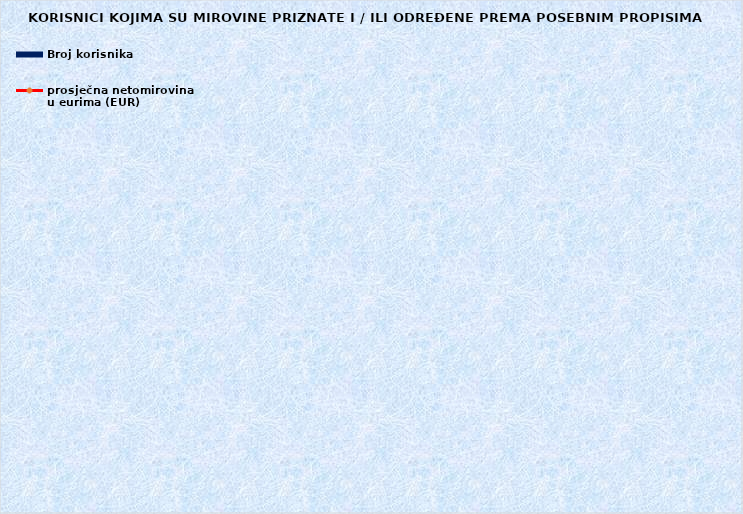
| Category | Broj korisnika |
|---|---|
|      a) radnici na poslovima ovlaštenih službenih osoba u tijelima unutarnjih 
poslova i pravosuđa, kojima je pravo na mirovinu priznato prema propisima
koji su bili na snazi do stupanja na snagu Zakona o pravima iz mirovinskog
osiguranja DVO, PS i OSO | 7064 |
|      b) radnici na  poslovima policijskih službenika, ovlaštenih službenih osoba pravosuđa i službene osobe s posebnim dužnostima i ovlastima u sigurnosno obavještajnom sustavu RH koji su pravo na mirovinu ostvarili prema Zakonu o pravima DVO, PS i OSO | 9452 |
|      c) radnici na poslovima razminiranja | 660 |
| Korisnici koji pravo na mirovinu ostvaruju prema Zakonu o vatrogastvu (NN 125/19)* | 347 |
| Djelatne vojne osobe - DVO  | 16032 |
| Pripadnici Hrvatske domovinske vojske od 1941. do 1945. godine | 1935 |
| Bivši politički zatvorenici | 2084 |
| Hrvatski branitelji iz Domovinskog rata - ZOHBDR | 71255 |
| Mirovine priznate prema općim propisima, a određene prema
ZOHBDR - u iz 2017. (čl. 27., 35., 48. i 49. stavak 2.)  | 57124 |
| Pripadnici bivše Jugoslavenske narodne armije - JNA | 3691 |
| Pripadnici bivše Jugoslavenske narodne armije - JNA - čl. 185 ZOMO | 158 |
| Sudionici Narodnooslobodilačkog rata - NOR | 5032 |
| Zastupnici u Hrvatskom saboru, članovi Vlade, suci Ustavnog suda i glavni državni revizor  | 681 |
| Članovi Izvršnog vijeća Sabora, Saveznog izvršnog vijeća i administrativno umirovljeni javni službenici | 67 |
| Bivši službenici u saveznim tijelima bivše SFRJ - članak 38. ZOMO | 18 |
| Redoviti članovi Hrvatske akademije znanosti i umjetnosti - HAZU | 127 |
| Radnici u Istarskim ugljenokopima "Tupljak" d.d. Labin  | 245 |
| Radnici profesionalno izloženi azbestu | 820 |
| Osiguranici - članovi posade broda u međunarodnoj plovidbi i nacionalnoj plovidbi - članak 129. a stavak 2. Pomorskog zakonika | 203 |
| Pripadnici Hrvatskog vijeća obrane  - HVO  | 6727 |